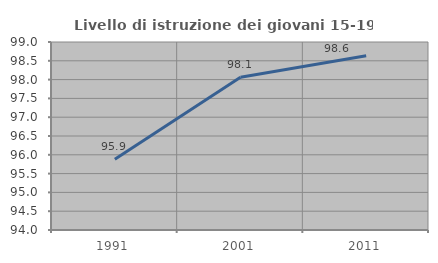
| Category | Livello di istruzione dei giovani 15-19 anni |
|---|---|
| 1991.0 | 95.88 |
| 2001.0 | 98.06 |
| 2011.0 | 98.634 |